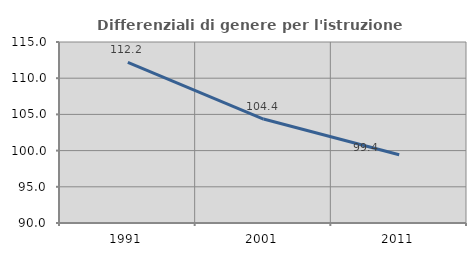
| Category | Differenziali di genere per l'istruzione superiore |
|---|---|
| 1991.0 | 112.175 |
| 2001.0 | 104.357 |
| 2011.0 | 99.434 |